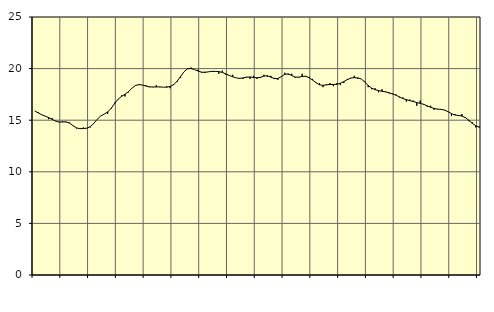
| Category | Piggar | Series 1 |
|---|---|---|
| nan | 15.9 | 15.89 |
| 87.0 | 15.8 | 15.71 |
| 87.0 | 15.5 | 15.53 |
| 87.0 | 15.4 | 15.39 |
| nan | 15.1 | 15.26 |
| 88.0 | 15.2 | 15.09 |
| 88.0 | 14.9 | 14.92 |
| 88.0 | 14.8 | 14.82 |
| nan | 14.9 | 14.83 |
| 89.0 | 14.8 | 14.84 |
| 89.0 | 14.8 | 14.72 |
| 89.0 | 14.5 | 14.48 |
| nan | 14.2 | 14.26 |
| 90.0 | 14.2 | 14.18 |
| 90.0 | 14.3 | 14.19 |
| 90.0 | 14.2 | 14.23 |
| nan | 14.3 | 14.37 |
| 91.0 | 14.7 | 14.69 |
| 91.0 | 15.1 | 15.09 |
| 91.0 | 15.4 | 15.41 |
| nan | 15.6 | 15.59 |
| 92.0 | 15.6 | 15.8 |
| 92.0 | 16.1 | 16.15 |
| 92.0 | 16.7 | 16.61 |
| nan | 17 | 17.03 |
| 93.0 | 17.4 | 17.31 |
| 93.0 | 17.3 | 17.51 |
| 93.0 | 17.7 | 17.77 |
| nan | 18.1 | 18.1 |
| 94.0 | 18.4 | 18.36 |
| 94.0 | 18.5 | 18.45 |
| 94.0 | 18.4 | 18.41 |
| nan | 18.4 | 18.31 |
| 95.0 | 18.2 | 18.23 |
| 95.0 | 18.2 | 18.22 |
| 95.0 | 18.4 | 18.22 |
| nan | 18.2 | 18.23 |
| 96.0 | 18.2 | 18.2 |
| 96.0 | 18.3 | 18.2 |
| 96.0 | 18.1 | 18.27 |
| nan | 18.5 | 18.44 |
| 97.0 | 18.7 | 18.78 |
| 97.0 | 19.1 | 19.24 |
| 97.0 | 19.7 | 19.7 |
| nan | 20 | 19.99 |
| 98.0 | 20.1 | 20.01 |
| 98.0 | 19.9 | 19.9 |
| 98.0 | 19.9 | 19.77 |
| nan | 19.6 | 19.66 |
| 99.0 | 19.7 | 19.63 |
| 99.0 | 19.7 | 19.69 |
| 99.0 | 19.7 | 19.73 |
| nan | 19.7 | 19.73 |
| 0.0 | 19.5 | 19.71 |
| 0.0 | 19.8 | 19.63 |
| 0.0 | 19.4 | 19.49 |
| nan | 19.3 | 19.34 |
| 1.0 | 19.4 | 19.21 |
| 1.0 | 19.1 | 19.1 |
| 1.0 | 19 | 19.05 |
| nan | 19 | 19.1 |
| 2.0 | 19.2 | 19.17 |
| 2.0 | 19 | 19.19 |
| 2.0 | 19.3 | 19.14 |
| nan | 19 | 19.11 |
| 3.0 | 19.1 | 19.15 |
| 3.0 | 19.4 | 19.27 |
| 3.0 | 19.2 | 19.31 |
| nan | 19.3 | 19.17 |
| 4.0 | 19.1 | 19.03 |
| 4.0 | 18.9 | 19.04 |
| 4.0 | 19.2 | 19.22 |
| nan | 19.6 | 19.44 |
| 5.0 | 19.4 | 19.49 |
| 5.0 | 19.5 | 19.33 |
| 5.0 | 19.1 | 19.18 |
| nan | 19.1 | 19.17 |
| 6.0 | 19.5 | 19.24 |
| 6.0 | 19.2 | 19.26 |
| 6.0 | 19.2 | 19.12 |
| nan | 19 | 18.89 |
| 7.0 | 18.6 | 18.63 |
| 7.0 | 18.6 | 18.43 |
| 7.0 | 18.2 | 18.38 |
| nan | 18.5 | 18.42 |
| 8.0 | 18.6 | 18.46 |
| 8.0 | 18.3 | 18.46 |
| 8.0 | 18.6 | 18.48 |
| nan | 18.4 | 18.58 |
| 9.0 | 18.6 | 18.74 |
| 9.0 | 19 | 18.93 |
| 9.0 | 19.1 | 19.08 |
| nan | 19.3 | 19.12 |
| 10.0 | 19 | 19.1 |
| 10.0 | 19 | 19 |
| 10.0 | 18.8 | 18.72 |
| nan | 18.2 | 18.37 |
| 11.0 | 18 | 18.11 |
| 11.0 | 18.1 | 17.96 |
| 11.0 | 17.7 | 17.87 |
| nan | 18 | 17.8 |
| 12.0 | 17.8 | 17.74 |
| 12.0 | 17.6 | 17.66 |
| 12.0 | 17.6 | 17.54 |
| nan | 17.5 | 17.43 |
| 13.0 | 17.2 | 17.26 |
| 13.0 | 17.2 | 17.1 |
| 13.0 | 16.8 | 16.99 |
| nan | 17 | 16.9 |
| 14.0 | 16.9 | 16.81 |
| 14.0 | 16.4 | 16.71 |
| 14.0 | 16.9 | 16.63 |
| nan | 16.5 | 16.54 |
| 15.0 | 16.3 | 16.39 |
| 15.0 | 16.4 | 16.25 |
| 15.0 | 16 | 16.14 |
| nan | 16.1 | 16.07 |
| 16.0 | 16 | 16.05 |
| 16.0 | 16 | 15.98 |
| 16.0 | 15.8 | 15.83 |
| nan | 15.4 | 15.64 |
| 17.0 | 15.6 | 15.5 |
| 17.0 | 15.4 | 15.46 |
| 17.0 | 15.6 | 15.4 |
| nan | 15.3 | 15.25 |
| 18.0 | 14.9 | 14.99 |
| 18.0 | 14.8 | 14.69 |
| 18.0 | 14.3 | 14.46 |
| nan | 14.4 | 14.31 |